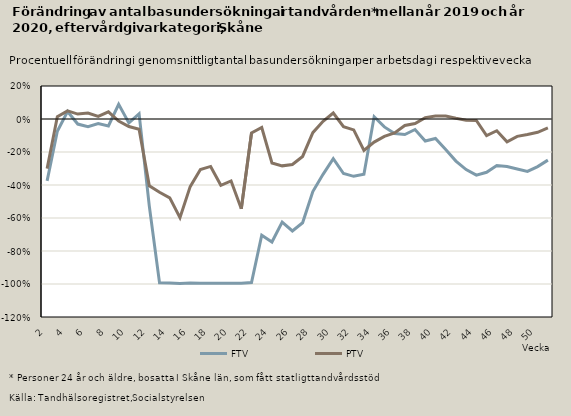
| Category | FTV | PTV |
|---|---|---|
| 2.0 | -0.375 | -0.301 |
| 3.0 | -0.074 | 0.014 |
| 4.0 | 0.045 | 0.049 |
| 5.0 | -0.031 | 0.03 |
| 6.0 | -0.047 | 0.037 |
| 7.0 | -0.027 | 0.015 |
| 8.0 | -0.042 | 0.044 |
| 9.0 | 0.089 | -0.013 |
| 10.0 | -0.024 | -0.046 |
| 11.0 | 0.031 | -0.062 |
| 12.0 | -0.528 | -0.405 |
| 13.0 | -0.993 | -0.444 |
| 14.0 | -0.993 | -0.478 |
| 15.0 | -0.997 | -0.598 |
| 16.0 | -0.994 | -0.41 |
| 17.0 | -0.996 | -0.306 |
| 18.0 | -0.995 | -0.287 |
| 19.0 | -0.996 | -0.402 |
| 20.0 | -0.995 | -0.376 |
| 21.0 | -0.995 | -0.545 |
| 22.0 | -0.992 | -0.085 |
| 23.0 | -0.704 | -0.051 |
| 24.0 | -0.745 | -0.266 |
| 25.0 | -0.625 | -0.284 |
| 26.0 | -0.678 | -0.275 |
| 27.0 | -0.629 | -0.227 |
| 28.0 | -0.44 | -0.083 |
| 29.0 | -0.335 | -0.014 |
| 30.0 | -0.24 | 0.036 |
| 31.0 | -0.33 | -0.047 |
| 32.0 | -0.347 | -0.066 |
| 33.0 | -0.334 | -0.19 |
| 34.0 | 0.013 | -0.14 |
| 35.0 | -0.048 | -0.105 |
| 36.0 | -0.088 | -0.084 |
| 37.0 | -0.094 | -0.039 |
| 38.0 | -0.064 | -0.027 |
| 39.0 | -0.134 | 0.008 |
| 40.0 | -0.118 | 0.018 |
| 41.0 | -0.185 | 0.019 |
| 42.0 | -0.255 | 0.004 |
| 43.0 | -0.307 | -0.007 |
| 44.0 | -0.34 | -0.009 |
| 45.0 | -0.323 | -0.101 |
| 46.0 | -0.281 | -0.071 |
| 47.0 | -0.288 | -0.138 |
| 48.0 | -0.303 | -0.105 |
| 49.0 | -0.317 | -0.094 |
| 50.0 | -0.289 | -0.081 |
| 51.0 | -0.249 | -0.054 |